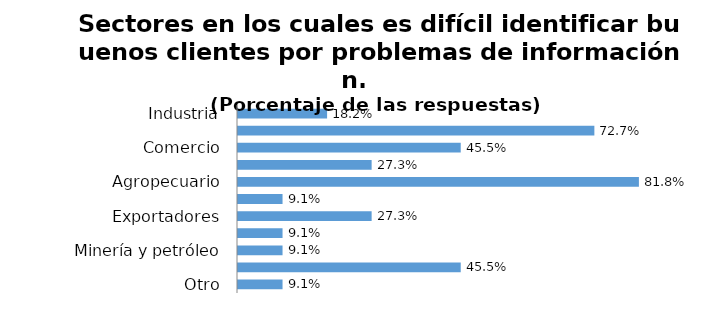
| Category | Series 0 |
|---|---|
| Industria | 0.182 |
| Servicios | 0.727 |
| Comercio | 0.455 |
| Construcción | 0.273 |
| Agropecuario | 0.818 |
| Comunicaciones | 0.091 |
| Exportadores | 0.273 |
| Importadores | 0.091 |
| Minería y petróleo | 0.091 |
| Personas naturales | 0.455 |
| Otro | 0.091 |